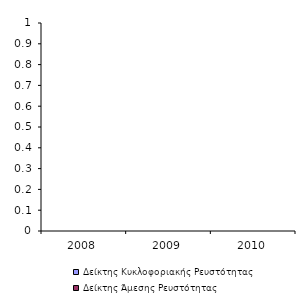
| Category | Δείκτης Κυκλοφοριακής Ρευστότητας | Δείκτης Άμεσης Ρευστότητας |
|---|---|---|
| 2008.0 | 0 | 0 |
| 2009.0 | 0 | 0 |
| 2010.0 | 0 | 0 |